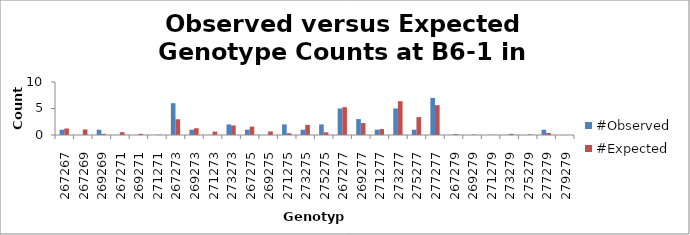
| Category | #Observed | #Expected |
|---|---|---|
| 267267.0 | 1 | 1.225 |
| 267269.0 | 0 | 1.05 |
| 269269.0 | 1 | 0.225 |
| 267271.0 | 0 | 0.525 |
| 269271.0 | 0 | 0.225 |
| 271271.0 | 0 | 0.056 |
| 267273.0 | 6 | 2.975 |
| 269273.0 | 1 | 1.275 |
| 271273.0 | 0 | 0.638 |
| 273273.0 | 2 | 1.806 |
| 267275.0 | 1 | 1.575 |
| 269275.0 | 0 | 0.675 |
| 271275.0 | 2 | 0.338 |
| 273275.0 | 1 | 1.912 |
| 275275.0 | 2 | 0.506 |
| 267277.0 | 5 | 5.25 |
| 269277.0 | 3 | 2.25 |
| 271277.0 | 1 | 1.125 |
| 273277.0 | 5 | 6.375 |
| 275277.0 | 1 | 3.375 |
| 277277.0 | 7 | 5.625 |
| 267279.0 | 0 | 0.175 |
| 269279.0 | 0 | 0.075 |
| 271279.0 | 0 | 0.038 |
| 273279.0 | 0 | 0.212 |
| 275279.0 | 0 | 0.112 |
| 277279.0 | 1 | 0.375 |
| 279279.0 | 0 | 0.006 |